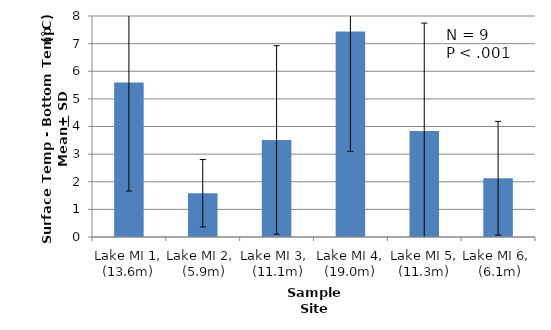
| Category | Series 0 |
|---|---|
| Lake MI 1, (13.6m) | 5.596 |
| Lake MI 2,   (5.9m) | 1.583 |
| Lake MI 3,   (11.1m) | 3.514 |
| Lake MI 4, (19.0m) | 7.439 |
| Lake MI 5, (11.3m) | 3.84 |
| Lake MI 6,   (6.1m) | 2.128 |